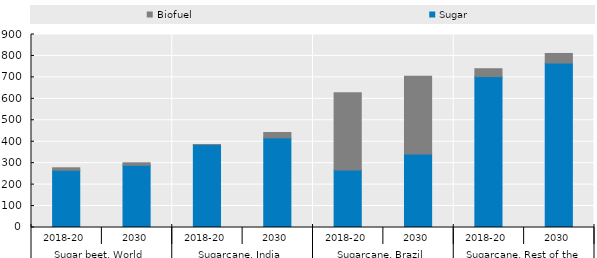
| Category | Sugar  | Biofuel |
|---|---|---|
| 0 | 266.64 | 11.809 |
| 1 | 290.063 | 11.719 |
| 2 | 386.628 | 0.347 |
| 3 | 418.172 | 24.892 |
| 4 | 267.971 | 360.437 |
| 5 | 343.126 | 362.037 |
| 6 | 703.719 | 36.634 |
| 7 | 767.029 | 44.548 |